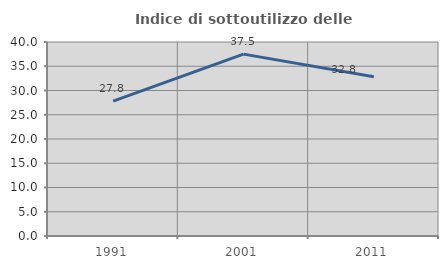
| Category | Indice di sottoutilizzo delle abitazioni  |
|---|---|
| 1991.0 | 27.815 |
| 2001.0 | 37.5 |
| 2011.0 | 32.847 |